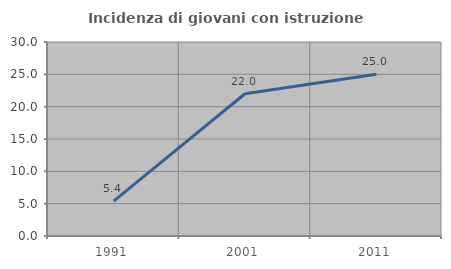
| Category | Incidenza di giovani con istruzione universitaria |
|---|---|
| 1991.0 | 5.405 |
| 2001.0 | 22 |
| 2011.0 | 25 |